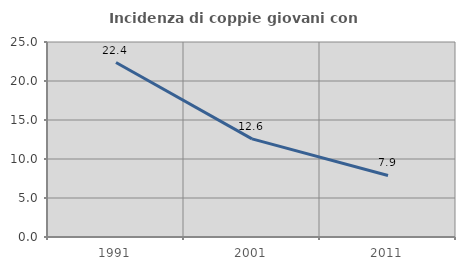
| Category | Incidenza di coppie giovani con figli |
|---|---|
| 1991.0 | 22.371 |
| 2001.0 | 12.574 |
| 2011.0 | 7.893 |